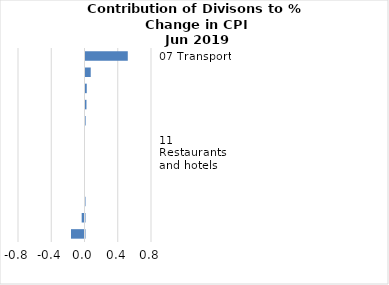
| Category |     Contributions |
|---|---|
| 07 Transport | 0.509 |
| 05 Furnishings, household equipment and routine household maintenance | 0.063 |
| 02 Alcoholic beverages, tobacco and narcotics | 0.015 |
| 03 Clothing and footwear | 0.012 |
| 04 Housing, water, electricity, gas and other fuels | 0.001 |
| 10 Education | 0 |
| 11 Restaurants and hotels | 0 |
| 06 Health | 0 |
| 08 Communication | 0 |
| 09 Recreation and culture | -0.006 |
| 12 Miscellaneous goods and services | -0.034 |
| 01 Food and non-alcoholic beverages | -0.163 |